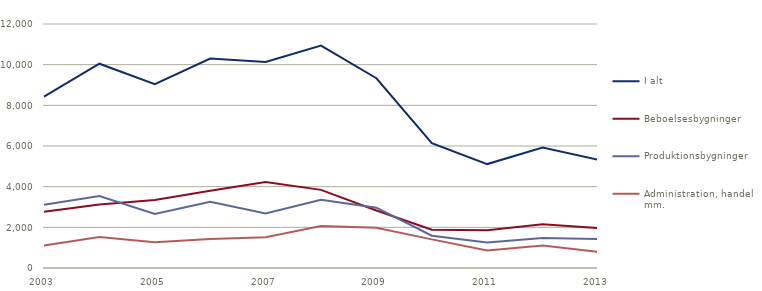
| Category | I alt | Beboelsesbygninger | Produktionsbygninger | Administration, handel mm. |
|---|---|---|---|---|
| 2003 | 8425.837 | 2770.887 | 3105.582 | 1103.928 |
| 2004 | 10047.311 | 3124.233 | 3541.23 | 1520.368 |
| 2005 | 9044.33 | 3346.45 | 2658.36 | 1264.929 |
| 2006 | 10301.552 | 3803.586 | 3251.834 | 1427.367 |
| 2007 | 10134.287 | 4225.808 | 2687.494 | 1515.96 |
| 2008 | 10940.653 | 3841.772 | 3355.229 | 2062.984 |
| 2009 | 9332.801 | 2827.721 | 2966.465 | 1979.234 |
| 2010 | 6138.501 | 1878.192 | 1586.237 | 1408.07 |
| 2011 | 5111.017 | 1853.65 | 1254.762 | 865.859 |
| 2012 | 5919.09 | 2146.214 | 1469.729 | 1110.599 |
| 2013 | 5322.219 | 1964.1 | 1431.518 | 796.526 |